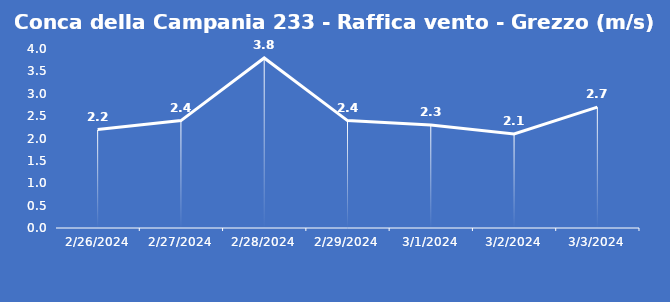
| Category | Conca della Campania 233 - Raffica vento - Grezzo (m/s) |
|---|---|
| 2/26/24 | 2.2 |
| 2/27/24 | 2.4 |
| 2/28/24 | 3.8 |
| 2/29/24 | 2.4 |
| 3/1/24 | 2.3 |
| 3/2/24 | 2.1 |
| 3/3/24 | 2.7 |